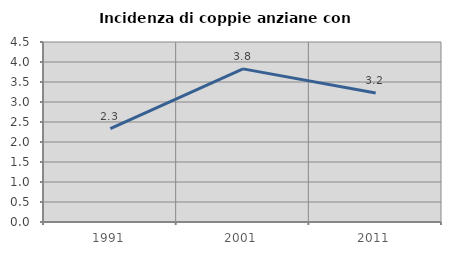
| Category | Incidenza di coppie anziane con figli |
|---|---|
| 1991.0 | 2.336 |
| 2001.0 | 3.828 |
| 2011.0 | 3.226 |